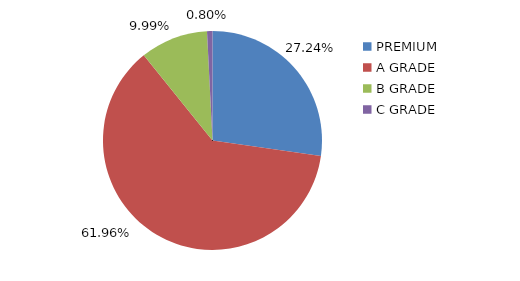
| Category | Series 0 |
|---|---|
| PREMIUM  | 0.272 |
| A GRADE | 0.62 |
| B GRADE | 0.1 |
| C GRADE | 0.008 |